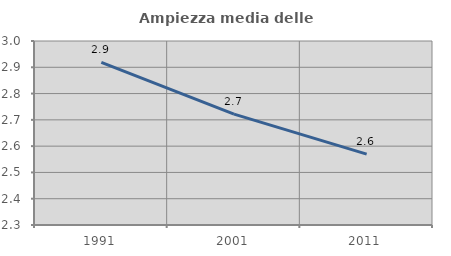
| Category | Ampiezza media delle famiglie |
|---|---|
| 1991.0 | 2.919 |
| 2001.0 | 2.722 |
| 2011.0 | 2.57 |